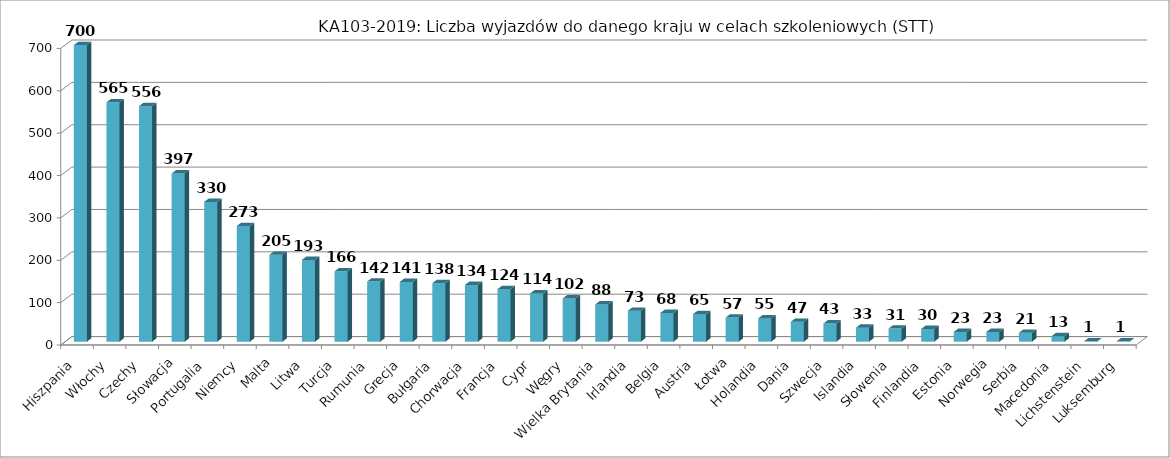
| Category | Liczba wyjazdów w celach szkoleniowych (STT) |
|---|---|
| Hiszpania | 700 |
| Włochy | 565 |
| Czechy | 556 |
| Słowacja | 397 |
| Portugalia | 330 |
| Niemcy | 273 |
| Malta | 205 |
| Litwa | 193 |
| Turcja | 166 |
| Rumunia | 142 |
| Grecja | 141 |
| Bułgaria | 138 |
| Chorwacja | 134 |
| Francja  | 124 |
| Cypr | 114 |
| Węgry | 102 |
| Wielka Brytania | 88 |
| Irlandia | 73 |
| Belgia | 68 |
| Austria | 65 |
| Łotwa | 57 |
| Holandia | 55 |
| Dania | 47 |
| Szwecja | 43 |
| Islandia | 33 |
| Słowenia | 31 |
| Finlandia | 30 |
| Estonia | 23 |
| Norwegia | 23 |
| Serbia | 21 |
| Macedonia | 13 |
| Lichstenstein | 1 |
| Luksemburg | 1 |